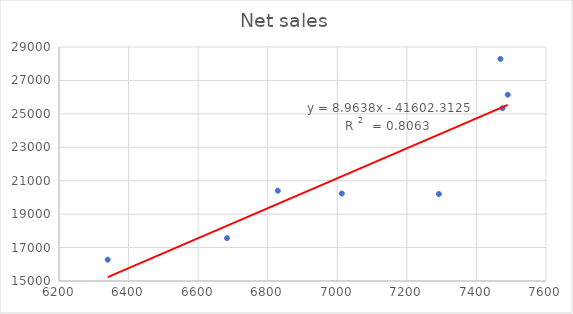
| Category | Net sales |
|---|---|
| 6340.0 | 16274 |
| 6683.0 | 17569 |
| 7013.0 | 20234 |
| 7292.0 | 20207 |
| 7475.0 | 25335 |
| 7490.0 | 26145 |
| 7469.0 | 28287 |
| 6829.0 | 20403 |